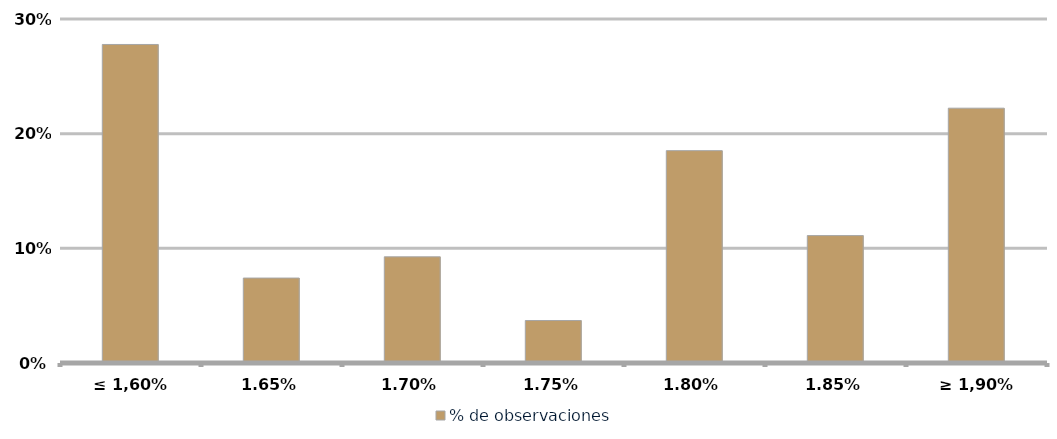
| Category | % de observaciones  |
|---|---|
| ≤ 1,60% | 0.278 |
| 1,65% | 0.074 |
| 1,70% | 0.093 |
| 1,75% | 0.037 |
| 1,80% | 0.185 |
| 1,85% | 0.111 |
| ≥ 1,90% | 0.222 |